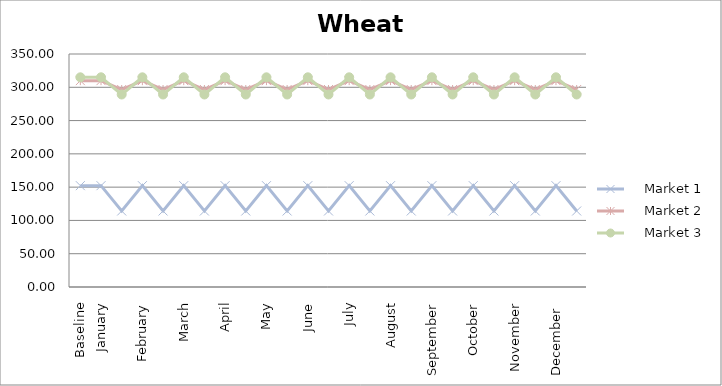
| Category |     Market 1 |     Market 2 |     Market 3 |
|---|---|---|---|
| Baseline | 152.222 | 310 | 315 |
| January | 152.222 | 310 | 315 |
|  | 114.167 | 296.667 | 289.167 |
| February | 152.222 | 310 | 315 |
|  | 114.167 | 296.667 | 289.167 |
| March | 152.222 | 310 | 315 |
|  | 114.167 | 296.667 | 289.167 |
| April | 152.222 | 310 | 315 |
|  | 114.167 | 296.667 | 289.167 |
| May | 152.222 | 310 | 315 |
|  | 114.167 | 296.667 | 289.167 |
| June | 152.222 | 310 | 315 |
|  | 114.167 | 296.667 | 289.167 |
| July | 152.222 | 310 | 315 |
|  | 114.167 | 296.667 | 289.167 |
| August | 152.222 | 310 | 315 |
|  | 114.167 | 296.667 | 289.167 |
| September | 152.222 | 310 | 315 |
|  | 114.167 | 296.667 | 289.167 |
| October | 152.222 | 310 | 315 |
|  | 114.167 | 296.667 | 289.167 |
| November | 152.222 | 310 | 315 |
|  | 114.167 | 296.667 | 289.167 |
| December  | 152.222 | 310 | 315 |